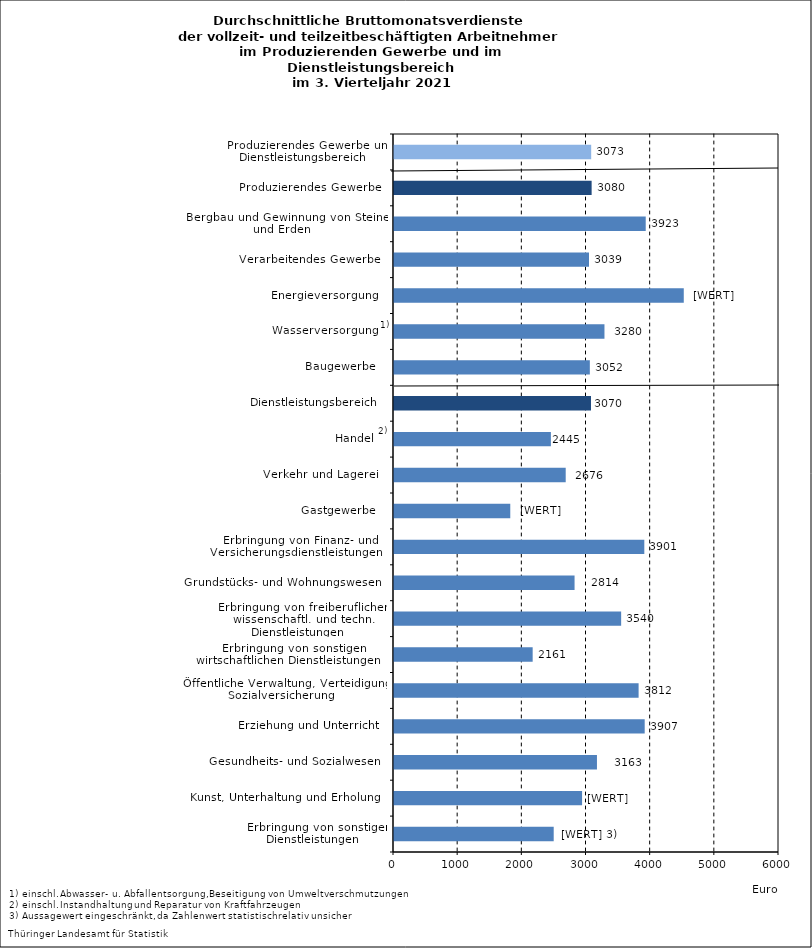
| Category | Series 0 |
|---|---|
| Erbringung von sonstigen Dienstleistungen    | 2489 |
| Kunst, Unterhaltung und Erholung    | 2931 |
| Gesundheits- und Sozialwesen    | 3163 |
| Erziehung und Unterricht    | 3907 |
| Öffentliche Verwaltung, Verteidigung, Sozialversicherung    | 3812 |
| Erbringung von sonstigen wirtschaftlichen Dienstleistungen    | 2161 |
| Erbringung von freiberuflichen, wissenschaftl. und techn. Dienstleistungen    | 3540 |
| Grundstücks- und Wohnungswesen    | 2814 |
| Erbringung von Finanz- und Versicherungsdienstleistungen    | 3901 |
| Gastgewerbe    | 1812 |
| Verkehr und Lagerei    | 2676 |
| Handel    | 2445 |
| Dienstleistungsbereich    | 3070 |
| Baugewerbe    | 3052 |
| Wasserversorgung    | 3280 |
| Energieversorgung    | 4516 |
| Verarbeitendes Gewerbe    | 3039 |
| Bergbau und Gewinnung von Steinen und Erden    | 3923 |
| Produzierendes Gewerbe    | 3080 |
| Produzierendes Gewerbe und Dienstleistungsbereich    | 3073 |